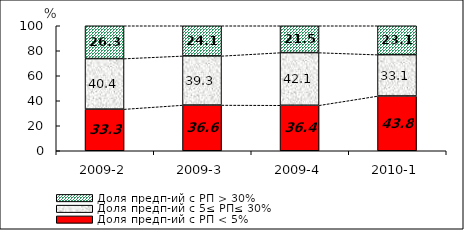
| Category | Доля предп-ий с РП < 5% | Доля предп-ий с 5≤ РП≤ 30% | Доля предп-ий с РП > 30% |
|---|---|---|---|
| 2009-2 | 33.309 | 40.436 | 26.255 |
| 2009-3 | 36.551 | 39.334 | 24.115 |
| 2009-4 | 36.397 | 42.132 | 21.471 |
| 2010-1 | 43.821 | 33.055 | 23.124 |